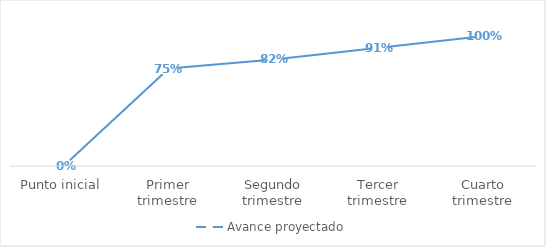
| Category | Avance proyectado |
|---|---|
| Punto inicial | 0 |
| Primer trimestre | 0.75 |
| Segundo trimestre | 0.82 |
| Tercer trimestre | 0.91 |
| Cuarto trimestre | 1 |